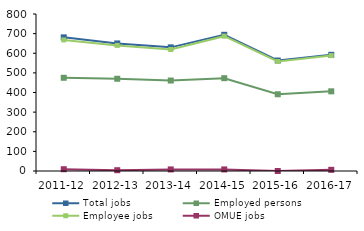
| Category | Total jobs | Employed persons | Employee jobs | OMUE jobs |
|---|---|---|---|---|
| 2011-12 | 681 | 475 | 668 | 9 |
| 2012-13 | 650 | 470 | 640 | 4 |
| 2013-14 | 630 | 461 | 619 | 8 |
| 2014-15 | 694 | 473 | 687 | 8 |
| 2015-16 | 563 | 391 | 558 | 0 |
| 2016-17 | 592 | 406 | 588 | 6 |